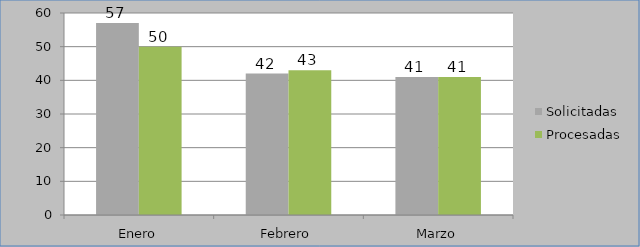
| Category | Solicitadas | Procesadas |
|---|---|---|
| Enero | 57 | 50 |
| Febrero | 42 | 43 |
| Marzo | 41 | 41 |